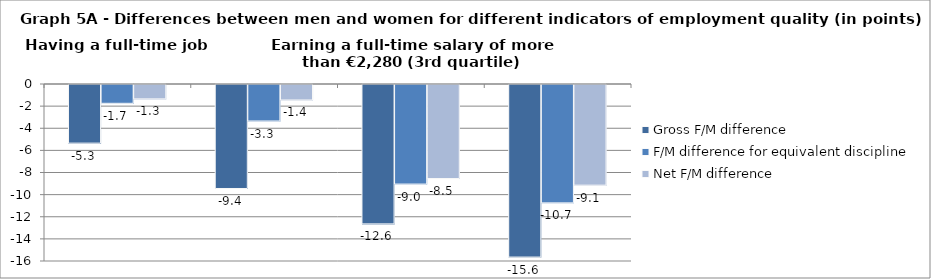
| Category | Gross F/M difference  | F/M difference for equivalent discipline | Net F/M difference |
|---|---|---|---|
| Having a full-time job | -5.3 | -1.7 | -1.3 |
| Having a stable job | -9.4 | -3.3 | -1.4 |
| Earning a full-time salary of more than €2,280 (3rd quartile) | -12.6 | -9 | -8.5 |
| Having a managerial job | -15.6 | -10.7 | -9.1 |